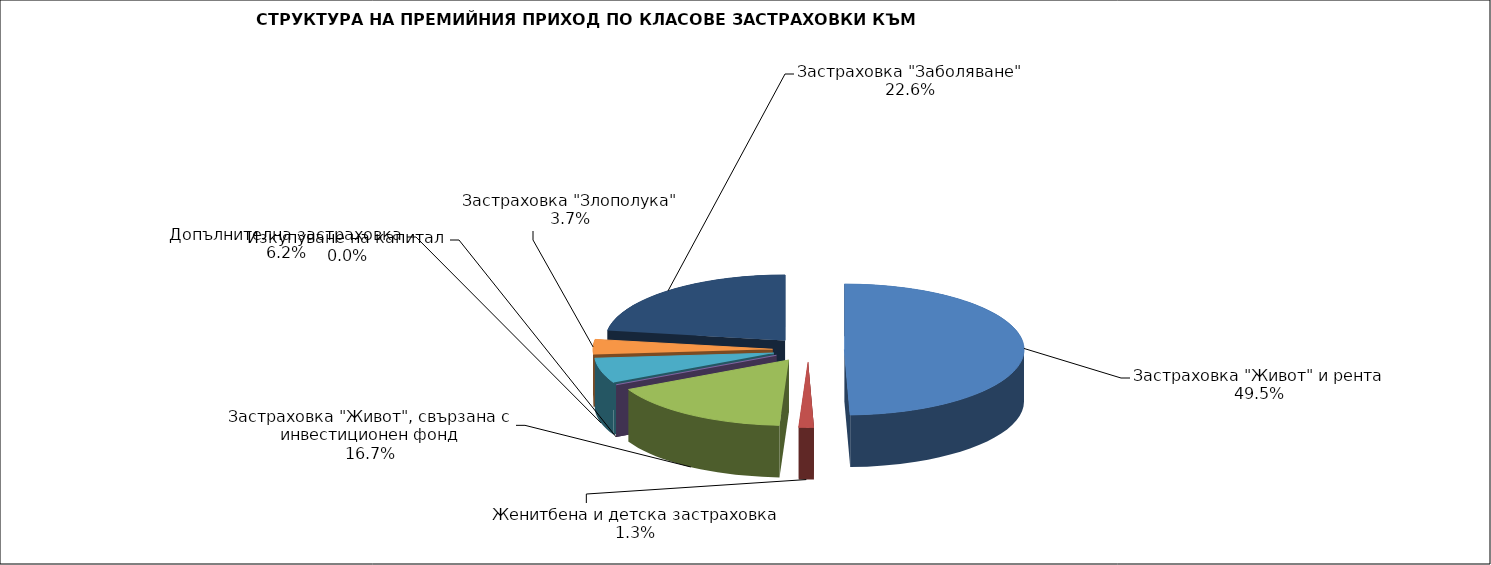
| Category | Series 0 |
|---|---|
| Застраховка "Живот" и рента | 27397305.233 |
| Женитбена и детска застраховка | 745279.571 |
| Застраховка "Живот", свързана с инвестиционен фонд | 9256247.644 |
| Изкупуване на капитал | 0 |
| Допълнителна застраховка | 3416982.932 |
| Застраховка "Злополука" | 2041297.416 |
| Застраховка "Заболяване" | 12506542.698 |